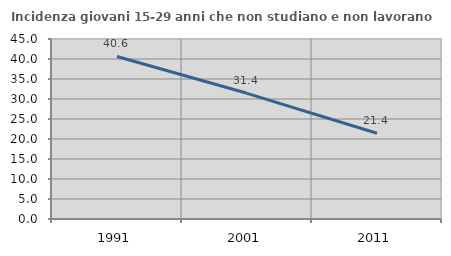
| Category | Incidenza giovani 15-29 anni che non studiano e non lavorano  |
|---|---|
| 1991.0 | 40.634 |
| 2001.0 | 31.421 |
| 2011.0 | 21.429 |